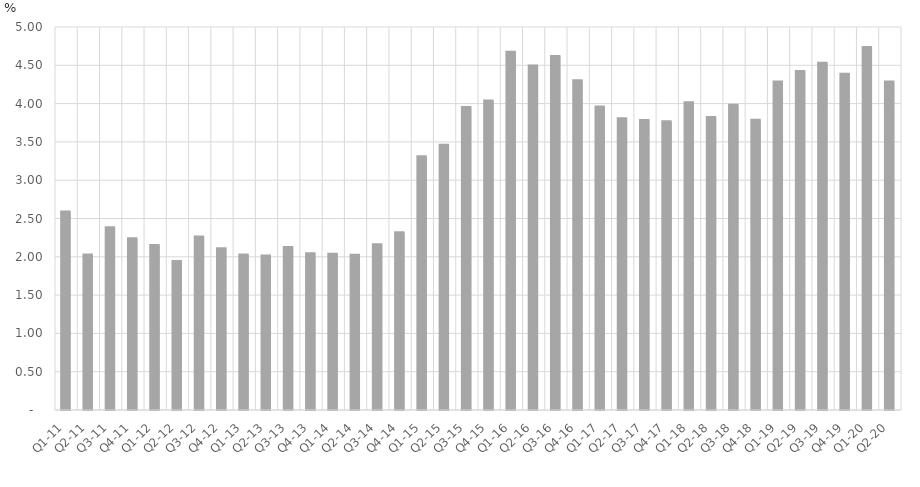
| Category | Percent of Total GDP |
|---|---|
| Q1-11 | 2.585 |
| Q2-11 | 2.024 |
| Q3-11 | 2.38 |
| Q4-11 | 2.236 |
| Q1-12 | 2.146 |
| Q2-12 | 1.94 |
| Q3-12 | 2.257 |
| Q4-12 | 2.104 |
| Q1-13 | 2.023 |
| Q2-13 | 2.01 |
| Q3-13 | 2.12 |
| Q4-13 | 2.04 |
| Q1-14 | 2.033 |
| Q2-14 | 2.021 |
| Q3-14 | 2.158 |
| Q4-14 | 2.315 |
| Q1-15 | 3.306 |
| Q2-15 | 3.457 |
| Q3-15 | 3.948 |
| Q4-15 | 4.034 |
| Q1-16 | 4.669 |
| Q2-16 | 4.49 |
| Q3-16 | 4.613 |
| Q4-16 | 4.299 |
| Q1-17 | 3.956 |
| Q2-17 | 3.802 |
| Q3-17 | 3.78 |
| Q4-17 | 3.762 |
| Q1-18 | 4.011 |
| Q2-18 | 3.818 |
| Q3-18 | 3.979 |
| Q4-18 | 3.781 |
| Q1-19 | 4.282 |
| Q2-19 | 4.42 |
| Q3-19 | 4.528 |
| Q4-19 | 4.384 |
| Q1-20 | 4.733 |
| Q2-20 | 4.28 |